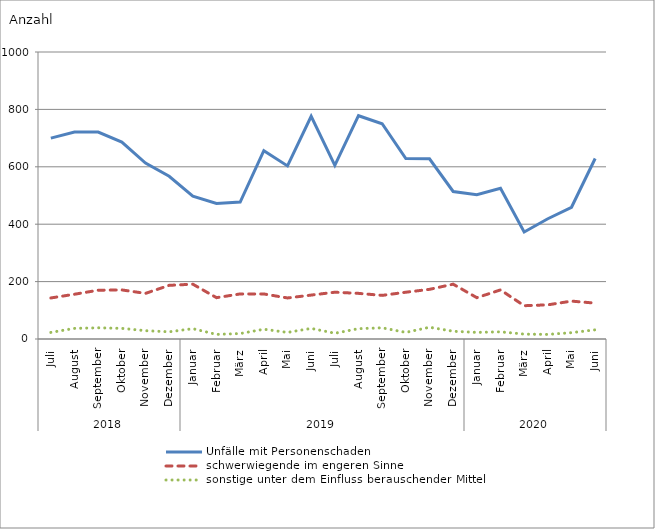
| Category | Unfälle mit Personenschaden | schwerwiegende im engeren Sinne | sonstige unter dem Einfluss berauschender Mittel |
|---|---|---|---|
| 0 | 700 | 143 | 23 |
| 1 | 721 | 156 | 37 |
| 2 | 721 | 170 | 39 |
| 3 | 686 | 171 | 37 |
| 4 | 613 | 159 | 29 |
| 5 | 567 | 187 | 25 |
| 6 | 498 | 191 | 36 |
| 7 | 472 | 144 | 16 |
| 8 | 477 | 157 | 19 |
| 9 | 656 | 157 | 34 |
| 10 | 603 | 143 | 23 |
| 11 | 776 | 153 | 37 |
| 12 | 605 | 163 | 20 |
| 13 | 778 | 159 | 36 |
| 14 | 750 | 152 | 39 |
| 15 | 629 | 163 | 23 |
| 16 | 628 | 173 | 41 |
| 17 | 514 | 191 | 27 |
| 18 | 503 | 144 | 23 |
| 19 | 525 | 171 | 25 |
| 20 | 373 | 116 | 17 |
| 21 | 419 | 119 | 16 |
| 22 | 459 | 132 | 22 |
| 23 | 629 | 125 | 32 |